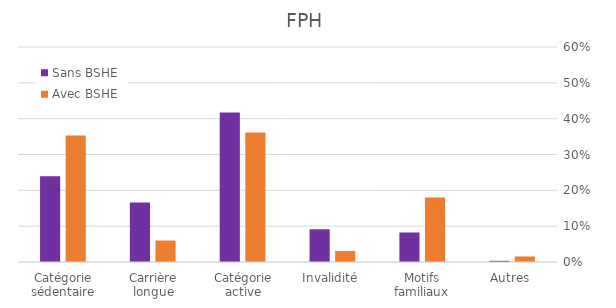
| Category | Sans BSHE | Avec BSHE |
|---|---|---|
| Catégorie sédentaire | 0.239 | 0.353 |
| Carrière longue | 0.166 | 0.06 |
| Catégorie active | 0.417 | 0.361 |
| Invalidité | 0.091 | 0.031 |
| Motifs familiaux | 0.082 | 0.18 |
| Autres | 0.003 | 0.015 |